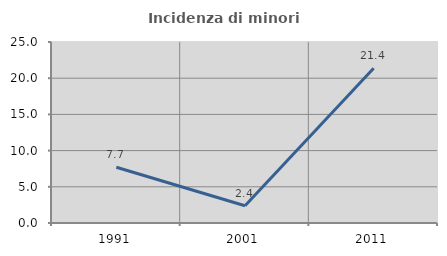
| Category | Incidenza di minori stranieri |
|---|---|
| 1991.0 | 7.692 |
| 2001.0 | 2.381 |
| 2011.0 | 21.386 |